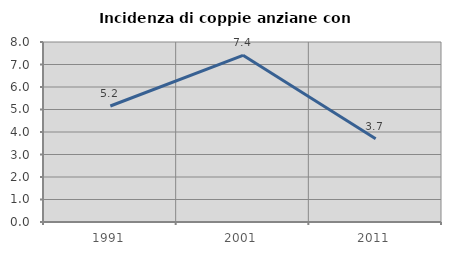
| Category | Incidenza di coppie anziane con figli |
|---|---|
| 1991.0 | 5.155 |
| 2001.0 | 7.407 |
| 2011.0 | 3.704 |